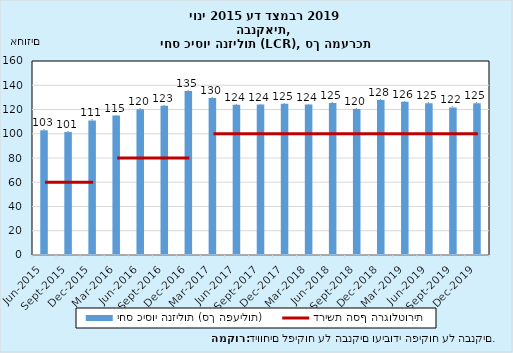
| Category | יחס כיסוי הנזילות (סך הפעילות) |
|---|---|
| 2015-06-30 | 102.846 |
| 2015-09-30 | 101.374 |
| 2015-12-31 | 110.942 |
| 2016-03-31 | 115.02 |
| 2016-06-30 | 120.173 |
| 2016-09-30 | 123.002 |
| 2016-12-31 | 135.285 |
| 2017-03-31 | 129.523 |
| 2017-06-30 | 123.841 |
| 2017-09-30 | 124.071 |
| 2017-12-31 | 124.656 |
| 2018-03-31 | 124.101 |
| 2018-06-30 | 125.26 |
| 2018-09-30 | 120.318 |
| 2018-12-31 | 127.832 |
| 2019-03-31 | 126.495 |
| 2019-06-30 | 125.095 |
| 2019-09-30 | 121.685 |
| 2019-12-31 | 125.254 |